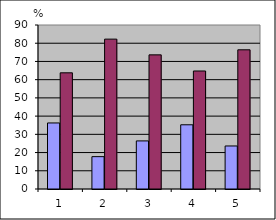
| Category | Series 0 | Series 1 |
|---|---|---|
| 0 | 36.242 | 63.758 |
| 1 | 17.752 | 82.248 |
| 2 | 26.389 | 73.611 |
| 3 | 35.238 | 64.762 |
| 4 | 23.611 | 76.389 |